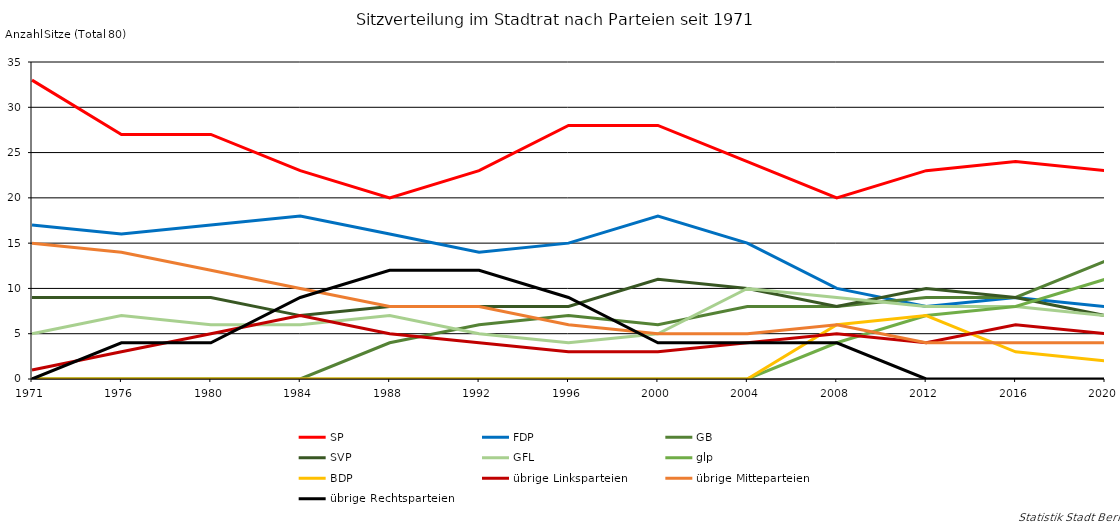
| Category | SP | FDP | GB | SVP | GFL | glp | BDP | übrige Linksparteien | übrige Mitteparteien | übrige Rechtsparteien |
|---|---|---|---|---|---|---|---|---|---|---|
| 1971.0 | 33 | 17 | 0 | 9 | 5 | 0 | 0 | 1 | 15 | 0 |
| 1976.0 | 27 | 16 | 0 | 9 | 7 | 0 | 0 | 3 | 14 | 4 |
| 1980.0 | 27 | 17 | 0 | 9 | 6 | 0 | 0 | 5 | 12 | 4 |
| 1984.0 | 23 | 18 | 0 | 7 | 6 | 0 | 0 | 7 | 10 | 9 |
| 1988.0 | 20 | 16 | 4 | 8 | 7 | 0 | 0 | 5 | 8 | 12 |
| 1992.0 | 23 | 14 | 6 | 8 | 5 | 0 | 0 | 4 | 8 | 12 |
| 1996.0 | 28 | 15 | 7 | 8 | 4 | 0 | 0 | 3 | 6 | 9 |
| 2000.0 | 28 | 18 | 6 | 11 | 5 | 0 | 0 | 3 | 5 | 4 |
| 2004.0 | 24 | 15 | 8 | 10 | 10 | 0 | 0 | 4 | 5 | 4 |
| 2008.0 | 20 | 10 | 8 | 8 | 9 | 4 | 6 | 5 | 6 | 4 |
| 2012.0 | 23 | 8 | 9 | 10 | 8 | 7 | 7 | 4 | 4 | 0 |
| 2016.0 | 24 | 9 | 9 | 9 | 8 | 8 | 3 | 6 | 4 | 0 |
| 2020.0 | 23 | 8 | 13 | 7 | 7 | 11 | 2 | 5 | 4 | 0 |